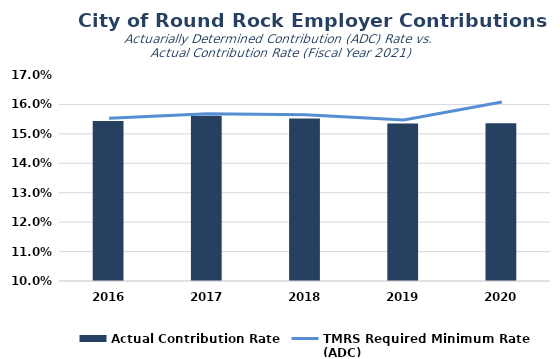
| Category | Actual Contribution Rate |
|---|---|
| 2016.0 | 0.154 |
| 2017.0 | 0.156 |
| 2018.0 | 0.155 |
| 2019.0 | 0.154 |
| 2020.0 | 0.154 |